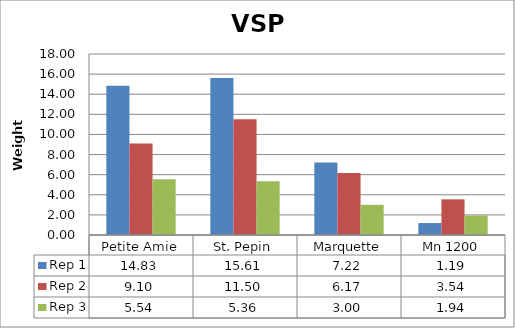
| Category | Rep 1 | Rep 2 | Rep 3 |
|---|---|---|---|
| 0 | 14.833 | 9.1 | 5.544 |
| 1 | 15.611 | 11.5 | 5.356 |
| 2 | 7.222 | 6.167 | 3 |
| 3 | 1.189 | 3.544 | 1.938 |